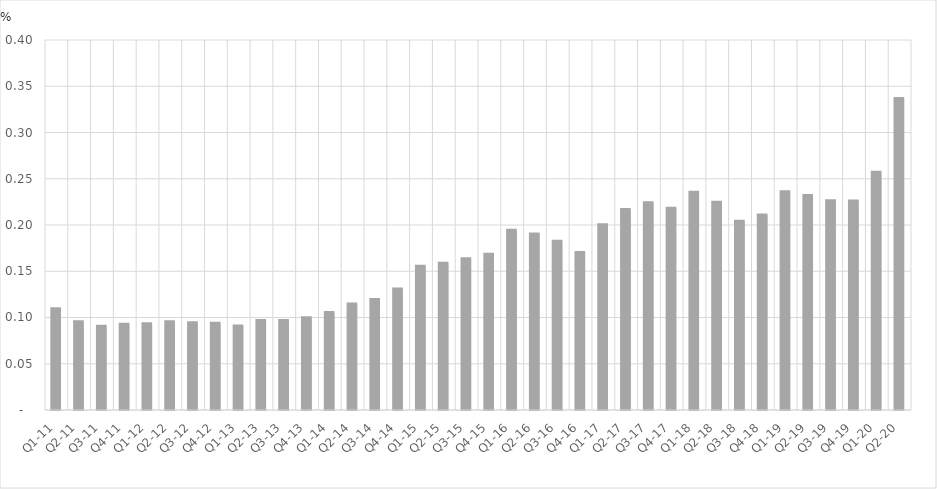
| Category | Percent of Total GDP |
|---|---|
| Q1-11 | 0.109 |
| Q2-11 | 0.095 |
| Q3-11 | 0.091 |
| Q4-11 | 0.093 |
| Q1-12 | 0.093 |
| Q2-12 | 0.095 |
| Q3-12 | 0.094 |
| Q4-12 | 0.094 |
| Q1-13 | 0.091 |
| Q2-13 | 0.097 |
| Q3-13 | 0.097 |
| Q4-13 | 0.1 |
| Q1-14 | 0.105 |
| Q2-14 | 0.115 |
| Q3-14 | 0.119 |
| Q4-14 | 0.131 |
| Q1-15 | 0.155 |
| Q2-15 | 0.159 |
| Q3-15 | 0.163 |
| Q4-15 | 0.168 |
| Q1-16 | 0.194 |
| Q2-16 | 0.19 |
| Q3-16 | 0.182 |
| Q4-16 | 0.17 |
| Q1-17 | 0.2 |
| Q2-17 | 0.217 |
| Q3-17 | 0.224 |
| Q4-17 | 0.218 |
| Q1-18 | 0.235 |
| Q2-18 | 0.225 |
| Q3-18 | 0.204 |
| Q4-18 | 0.211 |
| Q1-19 | 0.236 |
| Q2-19 | 0.232 |
| Q3-19 | 0.226 |
| Q4-19 | 0.226 |
| Q1-20 | 0.257 |
| Q2-20 | 0.337 |